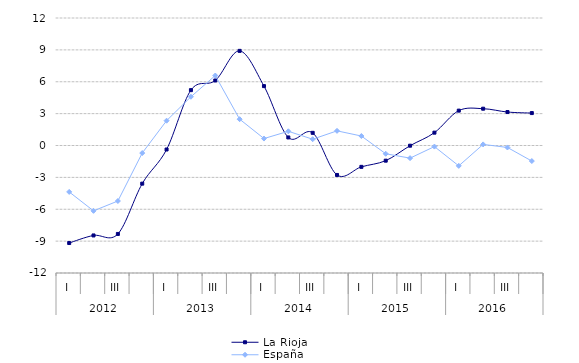
| Category | La Rioja  | España |
|---|---|---|
| 0 | -9.178 | -4.369 |
| 1 | -8.465 | -6.151 |
| 2 | -8.325 | -5.224 |
| 3 | -3.59 | -0.709 |
| 4 | -0.377 | 2.334 |
| 5 | 5.21 | 4.587 |
| 6 | 6.119 | 6.586 |
| 7 | 8.907 | 2.477 |
| 8 | 5.591 | 0.654 |
| 9 | 0.758 | 1.336 |
| 10 | 1.192 | 0.592 |
| 11 | -2.773 | 1.378 |
| 12 | -2.01 | 0.892 |
| 13 | -1.427 | -0.778 |
| 14 | -0.018 | -1.189 |
| 15 | 1.21 | -0.102 |
| 16 | 3.282 | -1.917 |
| 17 | 3.464 | 0.104 |
| 18 | 3.149 | -0.186 |
| 19 | 3.053 | -1.464 |